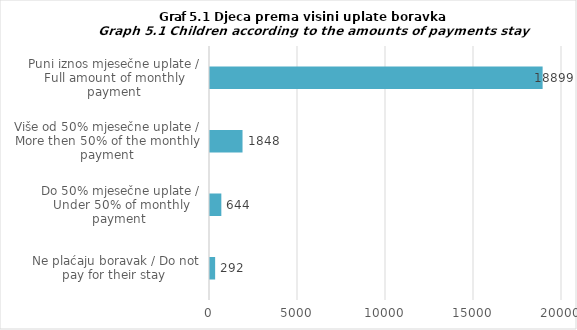
| Category | Series 4 |
|---|---|
| Ne plaćaju boravak / Do not pay for their stay  | 292 |
| Do 50% mjesečne uplate / Under 50% of monthly payment  | 644 |
| Više od 50% mjesečne uplate / More then 50% of the monthly payment | 1848 |
| Puni iznos mjesečne uplate / Full amount of monthly payment | 18899 |